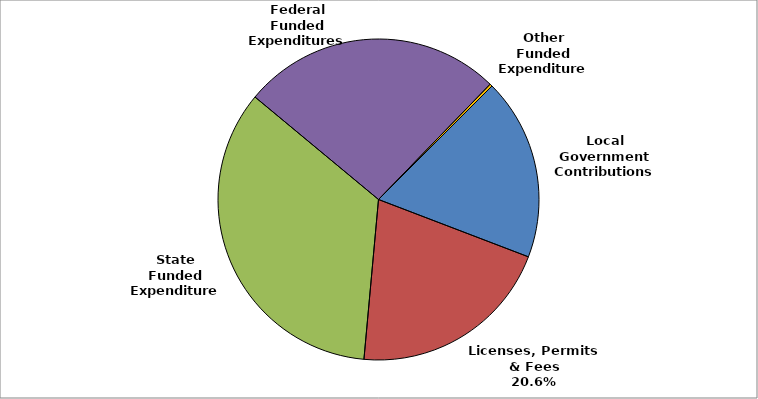
| Category | Series 0 |
|---|---|
| Local Government Contributions | 0.183 |
| Licenses, Permits & Fees | 0.206 |
| State Funded Expenditures | 0.346 |
| Federal Funded Expenditures | 0.262 |
| Other Funded Expenditures | 0.003 |